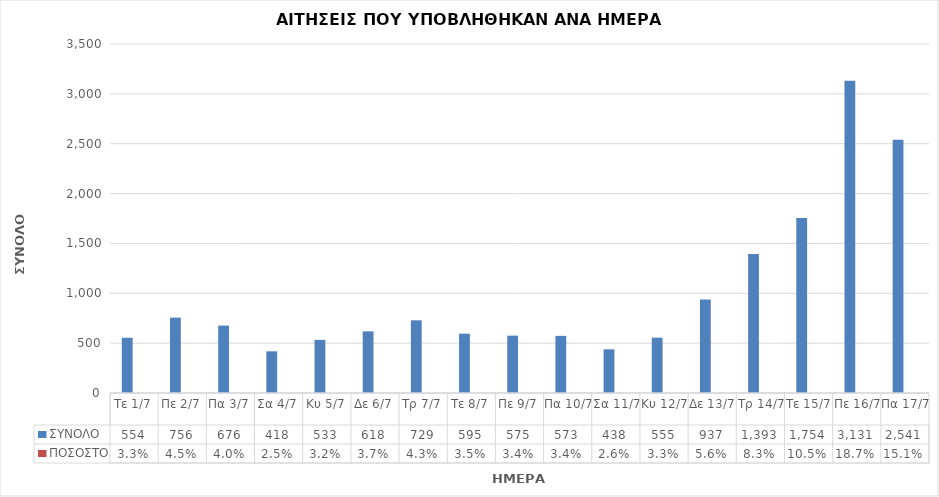
| Category | ΣΥΝΟΛΟ | ΠΟΣΟΣΤΟ |
|---|---|---|
| Τε 1/7 | 554 | 0.033 |
| Πε 2/7 | 756 | 0.045 |
| Πα 3/7 | 676 | 0.04 |
| Σα 4/7 | 418 | 0.025 |
| Κυ 5/7 | 533 | 0.032 |
| Δε 6/7 | 618 | 0.037 |
| Τρ 7/7 | 729 | 0.043 |
| Τε 8/7 | 595 | 0.035 |
| Πε 9/7 | 575 | 0.034 |
| Πα 10/7 | 573 | 0.034 |
| Σα 11/7 | 438 | 0.026 |
| Κυ 12/7 | 555 | 0.033 |
| Δε 13/7 | 937 | 0.056 |
| Τρ 14/7 | 1393 | 0.083 |
| Τε 15/7 | 1754 | 0.105 |
| Πε 16/7 | 3131 | 0.187 |
| Πα 17/7 | 2541 | 0.151 |